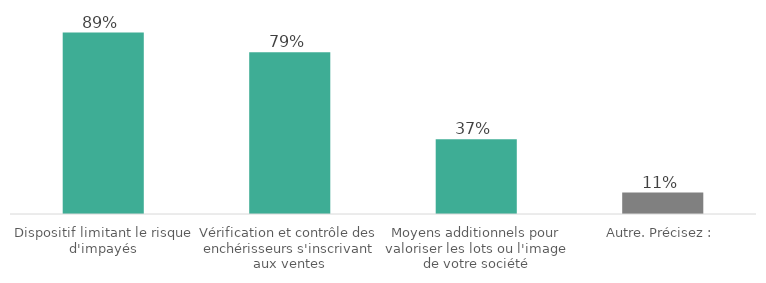
| Category | Series 0 |
|---|---|
| Dispositif limitant le risque d'impayés | 88.92 |
| Vérification et contrôle des enchérisseurs s'inscrivant aux ventes | 79.282 |
| Moyens additionnels pour valoriser les lots ou l'image de votre société | 36.623 |
| Autre. Précisez : | 10.538 |